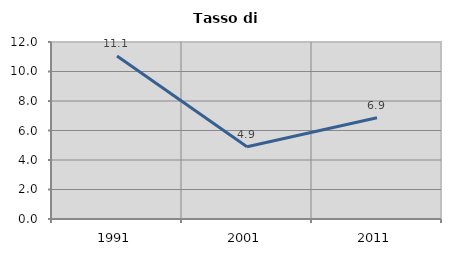
| Category | Tasso di disoccupazione   |
|---|---|
| 1991.0 | 11.053 |
| 2001.0 | 4.894 |
| 2011.0 | 6.87 |